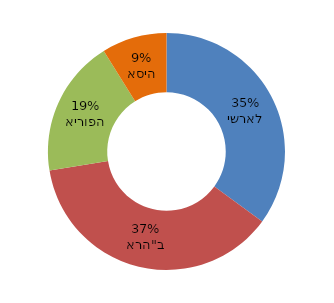
| Category | מכירות לפי שוק |
|---|---|
| ישראל | 75 |
| ארה"ב | 80 |
| אירופה | 40 |
| אסיה | 19 |